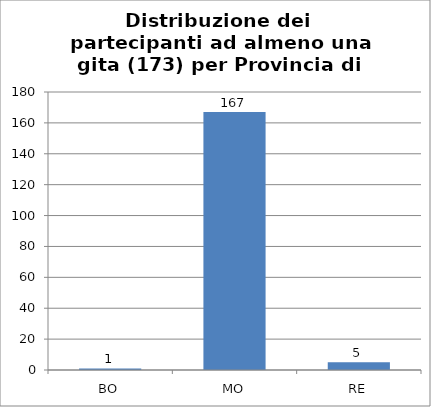
| Category | Nr. Tesserati |
|---|---|
| BO | 1 |
| MO | 167 |
| RE | 5 |